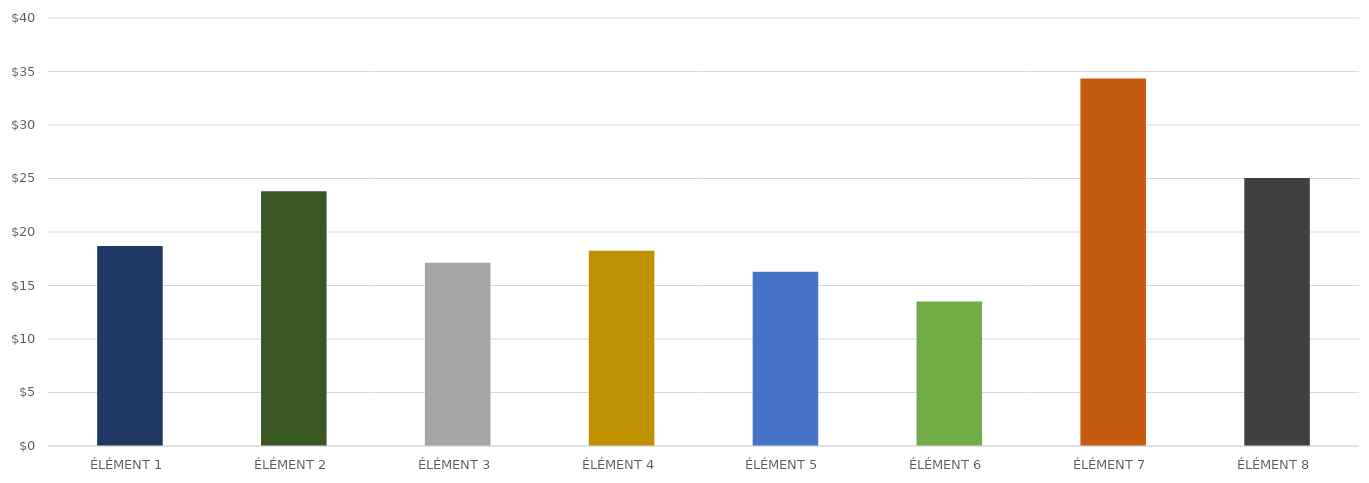
| Category | BÉNÉFICE PAR ÉLÉMENT |
|---|---|
| ÉLÉMENT 1 | 18.685 |
| ÉLÉMENT 2 | 23.815 |
| ÉLÉMENT 3 | 17.125 |
| ÉLÉMENT 4 | 18.25 |
| ÉLÉMENT 5 | 16.275 |
| ÉLÉMENT 6 | 13.5 |
| ÉLÉMENT 7 | 34.35 |
| ÉLÉMENT 8 | 25.04 |